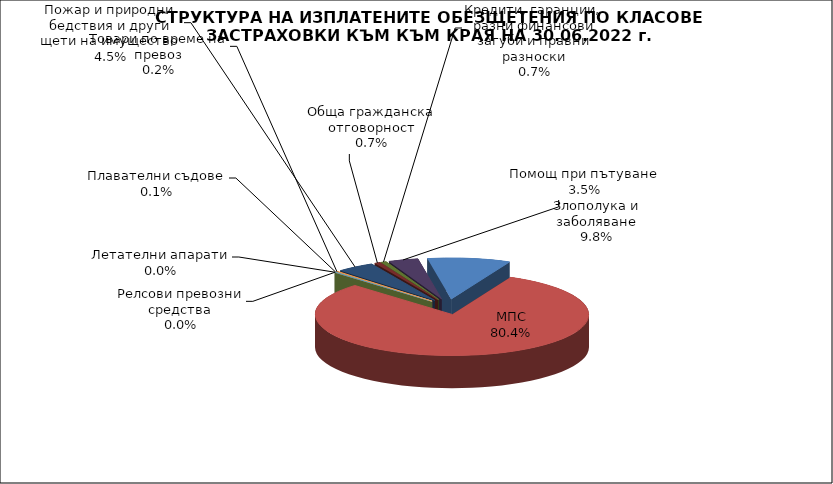
| Category | Злополука и заболяване |
|---|---|
| Злополука и заболяване | 0.098 |
| МПС | 0.804 |
| Релсови превозни средства | 0 |
| Летателни апарати | 0 |
| Плавателни съдове | 0.001 |
| Товари по време на превоз | 0.002 |
| Пожар и природни бедствия и други щети на имущество | 0.045 |
| Обща гражданска отговорност | 0.007 |
| Кредити, гаранции, разни финансови загуби и правни разноски | 0.007 |
| Помощ при пътуване | 0.035 |